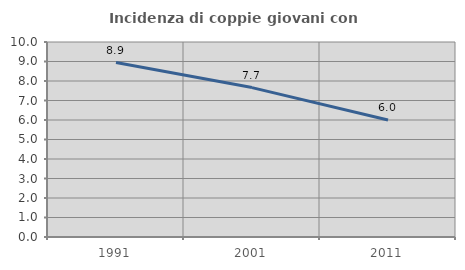
| Category | Incidenza di coppie giovani con figli |
|---|---|
| 1991.0 | 8.944 |
| 2001.0 | 7.662 |
| 2011.0 | 6 |